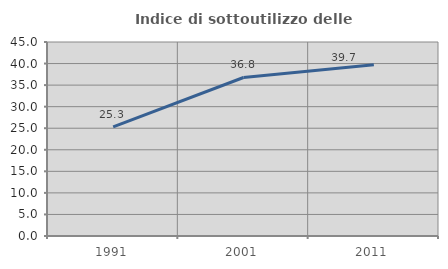
| Category | Indice di sottoutilizzo delle abitazioni  |
|---|---|
| 1991.0 | 25.323 |
| 2001.0 | 36.771 |
| 2011.0 | 39.739 |